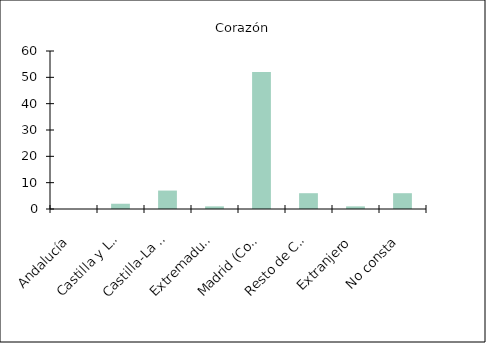
| Category | Corazón |
|---|---|
|    Andalucía | 0 |
|    Castilla y León | 2 |
|    Castilla-La Mancha | 7 |
|    Extremadura | 1 |
|    Madrid (Comunidad de) | 52 |
|    Resto de CCAA | 6 |
|    Extranjero | 1 |
|    No consta | 6 |